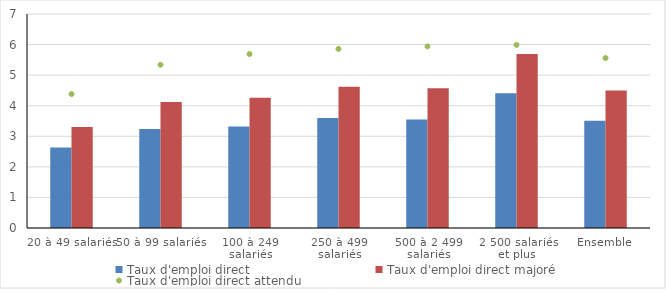
| Category | Taux d'emploi direct | Taux d'emploi direct majoré |
|---|---|---|
| 20 à 49 salariés | 2.63 | 3.3 |
| 50 à 99 salariés | 3.24 | 4.12 |
| 100 à 249 salariés | 3.32 | 4.26 |
| 250 à 499 salariés | 3.6 | 4.62 |
| 500 à 2 499 salariés | 3.55 | 4.57 |
| 2 500 salariés et plus | 4.41 | 5.69 |
| Ensemble | 3.51 | 4.5 |